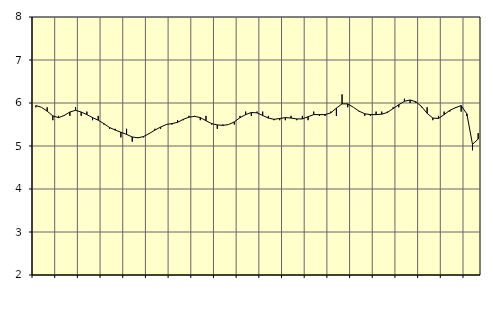
| Category | Piggar | Transport, SNI 49-53 |
|---|---|---|
| nan | 5.9 | 5.94 |
| 1.0 | 5.9 | 5.9 |
| 1.0 | 5.9 | 5.81 |
| 1.0 | 5.6 | 5.7 |
| nan | 5.7 | 5.66 |
| 2.0 | 5.7 | 5.71 |
| 2.0 | 5.7 | 5.79 |
| 2.0 | 5.9 | 5.83 |
| nan | 5.7 | 5.79 |
| 3.0 | 5.8 | 5.73 |
| 3.0 | 5.6 | 5.66 |
| 3.0 | 5.7 | 5.6 |
| nan | 5.5 | 5.52 |
| 4.0 | 5.4 | 5.43 |
| 4.0 | 5.4 | 5.37 |
| 4.0 | 5.2 | 5.32 |
| nan | 5.4 | 5.27 |
| 5.0 | 5.1 | 5.21 |
| 5.0 | 5.2 | 5.19 |
| 5.0 | 5.2 | 5.22 |
| nan | 5.3 | 5.29 |
| 6.0 | 5.4 | 5.37 |
| 6.0 | 5.4 | 5.44 |
| 6.0 | 5.5 | 5.5 |
| nan | 5.5 | 5.52 |
| 7.0 | 5.6 | 5.55 |
| 7.0 | 5.6 | 5.62 |
| 7.0 | 5.7 | 5.67 |
| nan | 5.7 | 5.69 |
| 8.0 | 5.6 | 5.66 |
| 8.0 | 5.7 | 5.59 |
| 8.0 | 5.5 | 5.52 |
| nan | 5.4 | 5.49 |
| 9.0 | 5.5 | 5.48 |
| 9.0 | 5.5 | 5.5 |
| 9.0 | 5.5 | 5.56 |
| nan | 5.7 | 5.66 |
| 10.0 | 5.8 | 5.73 |
| 10.0 | 5.7 | 5.78 |
| 10.0 | 5.8 | 5.77 |
| nan | 5.8 | 5.71 |
| 11.0 | 5.7 | 5.65 |
| 11.0 | 5.6 | 5.62 |
| 11.0 | 5.6 | 5.64 |
| nan | 5.6 | 5.66 |
| 12.0 | 5.7 | 5.65 |
| 12.0 | 5.6 | 5.63 |
| 12.0 | 5.7 | 5.63 |
| nan | 5.6 | 5.68 |
| 13.0 | 5.8 | 5.73 |
| 13.0 | 5.7 | 5.73 |
| 13.0 | 5.7 | 5.73 |
| nan | 5.8 | 5.77 |
| 14.0 | 5.7 | 5.88 |
| 14.0 | 6.2 | 5.98 |
| 14.0 | 5.9 | 5.98 |
| nan | 5.9 | 5.9 |
| 15.0 | 5.8 | 5.81 |
| 15.0 | 5.7 | 5.75 |
| 15.0 | 5.7 | 5.73 |
| nan | 5.8 | 5.73 |
| 16.0 | 5.8 | 5.74 |
| 16.0 | 5.8 | 5.78 |
| 16.0 | 5.9 | 5.87 |
| nan | 5.9 | 5.96 |
| 17.0 | 6.1 | 6.04 |
| 17.0 | 6 | 6.07 |
| 17.0 | 6 | 6.03 |
| nan | 5.9 | 5.92 |
| 18.0 | 5.9 | 5.76 |
| 18.0 | 5.6 | 5.65 |
| 18.0 | 5.7 | 5.64 |
| nan | 5.8 | 5.73 |
| 19.0 | 5.8 | 5.83 |
| 19.0 | 5.9 | 5.89 |
| 19.0 | 5.8 | 5.94 |
| nan | 5.7 | 5.75 |
| 20.0 | 4.9 | 5.04 |
| 20.0 | 5.3 | 5.16 |